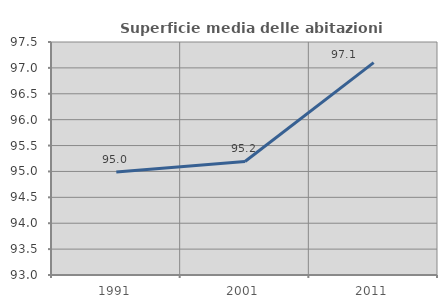
| Category | Superficie media delle abitazioni occupate |
|---|---|
| 1991.0 | 94.991 |
| 2001.0 | 95.193 |
| 2011.0 | 97.103 |